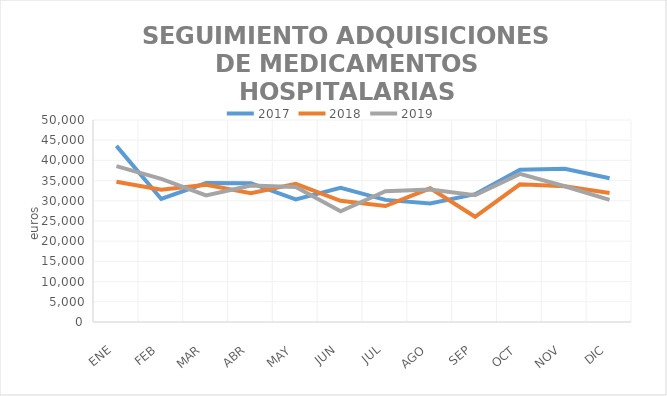
| Category | 2017 | 2018 | 2019 |
|---|---|---|---|
| ENE | 43586.11 | 34705 | 38600.49 |
| FEB | 30444.52 | 32738 | 35446.82 |
| MAR | 34405.33 | 33944 | 31351.47 |
| ABR | 34361.69 | 31875 | 33790.69 |
| MAY | 30331.37 | 34183 | 33420.57 |
| JUN | 33207.01 | 29991 | 27384.86 |
| JUL | 30228 | 28716 | 32376.08 |
| AGO | 29347.12 | 33099 | 32816.09 |
| SEP | 31649.06 | 26037 | 31367.83 |
| OCT | 37671 | 34089 | 36671.48 |
| NOV | 37926 | 33614 | 33593.25 |
| DIC | 35601 | 31914 | 30237.08 |